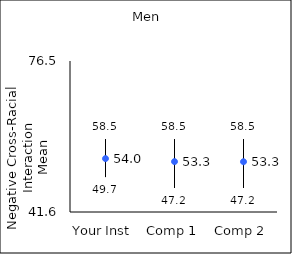
| Category | 25th percentile | 75th percentile | Mean |
|---|---|---|---|
| Your Inst | 49.7 | 58.5 | 53.98 |
| Comp 1 | 47.2 | 58.5 | 53.28 |
| Comp 2 | 47.2 | 58.5 | 53.25 |